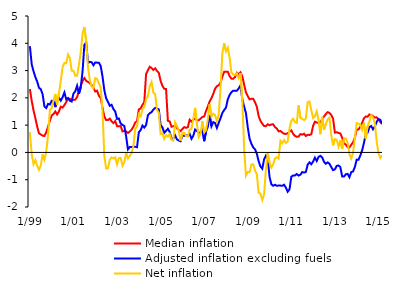
| Category | Median inflation | Adjusted inflation excluding fuels | Net inflation |
|---|---|---|---|
|  1/99 | 2.321 | 3.893 | 0.74 |
| 2 | 1.884 | 3.224 | -0.066 |
| 3 | 1.54 | 2.975 | -0.434 |
| 4 | 1.255 | 2.761 | -0.278 |
| 5 | 0.95 | 2.599 | -0.49 |
| 6 | 0.702 | 2.368 | -0.637 |
| 7 | 0.658 | 2.317 | -0.478 |
| 8 | 0.616 | 2.13 | -0.075 |
| 9 | 0.6 | 1.687 | -0.267 |
| 10 | 0.741 | 1.626 | 0.032 |
| 11 | 0.943 | 1.777 | 0.64 |
| 12 | 1.161 | 1.759 | 1.551 |
|  1/00 | 1.357 | 1.892 | 1.629 |
| 2 | 1.405 | 1.884 | 1.907 |
| 3 | 1.499 | 1.661 | 2.137 |
| 4 | 1.391 | 1.972 | 1.755 |
| 5 | 1.503 | 2.005 | 2.168 |
| 6 | 1.674 | 1.9 | 2.621 |
| 7 | 1.644 | 2.02 | 3.125 |
| 8 | 1.736 | 2.198 | 3.279 |
| 9 | 1.844 | 1.95 | 3.273 |
| 10 | 1.977 | 1.995 | 3.591 |
| 11 | 1.967 | 1.894 | 3.462 |
| 12 | 1.929 | 1.865 | 2.998 |
|  1/01 | 1.922 | 2.158 | 2.992 |
| 2 | 1.935 | 2.24 | 2.809 |
| 3 | 2.029 | 2.443 | 2.814 |
| 4 | 2.266 | 2.147 | 3.22 |
| 5 | 2.437 | 2.386 | 3.667 |
| 6 | 2.617 | 2.966 | 4.36 |
| 7 | 2.728 | 3.942 | 4.596 |
| 8 | 2.625 | 4.035 | 4.082 |
| 9 | 2.582 | 3.277 | 3.122 |
| 10 | 2.537 | 3.319 | 2.65 |
| 11 | 2.468 | 3.306 | 2.419 |
| 12 | 2.367 | 3.196 | 2.358 |
|  1/02 | 2.231 | 3.298 | 2.726 |
| 2 | 2.263 | 3.291 | 2.685 |
| 3 | 2.078 | 3.287 | 2.526 |
| 4 | 1.992 | 3.167 | 2.382 |
| 5 | 1.632 | 2.778 | 1.488 |
| 6 | 1.318 | 2.279 | -0.139 |
| 7 | 1.187 | 1.98 | -0.591 |
| 8 | 1.189 | 1.852 | -0.579 |
| 9 | 1.238 | 1.709 | -0.269 |
| 10 | 1.138 | 1.747 | -0.182 |
| 11 | 1.074 | 1.588 | -0.221 |
| 12 | 1.152 | 1.502 | -0.178 |
|  1/03 | 0.962 | 1.23 | -0.439 |
| 2 | 0.955 | 1.244 | -0.209 |
| 3 | 0.972 | 1.058 | -0.204 |
| 4 | 0.77 | 1.011 | -0.488 |
| 5 | 0.793 | 0.968 | -0.361 |
| 6 | 0.769 | 0.594 | -0.022 |
| 7 | 0.713 | 0.111 | -0.217 |
| 8 | 0.765 | 0.197 | -0.126 |
| 9 | 0.834 | 0.198 | -0.019 |
| 10 | 0.937 | 0.211 | 0.233 |
| 11 | 1.097 | 0.207 | 0.867 |
| 12 | 1.143 | 0.19 | 0.946 |
|  1/04 | 1.577 | 0.738 | 1.401 |
| 2 | 1.609 | 0.819 | 1.32 |
| 3 | 1.742 | 0.985 | 1.58 |
| 4 | 1.845 | 0.91 | 1.66 |
| 5 | 2.87 | 1.006 | 1.949 |
| 6 | 3.013 | 1.362 | 2.053 |
| 7 | 3.141 | 1.438 | 2.431 |
| 8 | 3.096 | 1.476 | 2.582 |
| 9 | 3.023 | 1.57 | 2.196 |
| 10 | 3.082 | 1.633 | 2.134 |
| 11 | 2.985 | 1.607 | 1.557 |
| 12 | 2.916 | 1.576 | 1.458 |
|  1/05 | 2.622 | 1.005 | 0.672 |
| 2 | 2.437 | 0.917 | 0.696 |
| 3 | 2.332 | 0.718 | 0.498 |
| 4 | 2.324 | 0.793 | 0.638 |
| 5 | 1.158 | 0.867 | 0.577 |
| 6 | 1.136 | 0.751 | 0.676 |
| 7 | 0.942 | 0.496 | 0.462 |
| 8 | 0.963 | 0.513 | 0.432 |
| 9 | 0.985 | 0.625 | 1.108 |
| 10 | 0.893 | 0.475 | 0.973 |
| 11 | 0.824 | 0.438 | 0.792 |
| 12 | 0.781 | 0.41 | 0.427 |
|  1/06 | 0.859 | 0.615 | 0.707 |
| 2 | 0.927 | 0.609 | 0.712 |
| 3 | 0.901 | 0.629 | 0.606 |
| 4 | 0.925 | 0.614 | 0.585 |
| 5 | 1.199 | 0.68 | 0.834 |
| 6 | 1.127 | 0.5 | 0.864 |
| 7 | 1.196 | 0.611 | 1.23 |
| 8 | 1.242 | 0.84 | 1.632 |
| 9 | 1.185 | 0.786 | 1.046 |
| 10 | 1.182 | 0.726 | 0.564 |
| 11 | 1.237 | 0.717 | 0.686 |
| 12 | 1.3 | 0.884 | 1.137 |
|  1/07 | 1.319 | 0.412 | 0.731 |
| 2 | 1.518 | 0.762 | 0.809 |
| 3 | 1.682 | 0.937 | 1.217 |
| 4 | 1.866 | 1.37 | 1.764 |
| 5 | 1.99 | 0.958 | 1.322 |
| 6 | 2.142 | 1.111 | 1.418 |
| 7 | 2.336 | 1.076 | 1.372 |
| 8 | 2.426 | 0.898 | 1.143 |
| 9 | 2.461 | 1.085 | 1.387 |
| 10 | 2.563 | 1.253 | 2.354 |
| 11 | 2.773 | 1.446 | 3.629 |
| 12 | 2.953 | 1.554 | 3.999 |
|  1/08 | 2.96 | 1.641 | 3.709 |
| 2 | 2.96 | 1.944 | 3.843 |
| 3 | 2.796 | 2.103 | 3.475 |
| 4 | 2.704 | 2.209 | 2.933 |
| 5 | 2.7 | 2.262 | 2.85 |
| 6 | 2.762 | 2.255 | 2.836 |
| 7 | 2.921 | 2.264 | 2.9 |
| 8 | 2.872 | 2.342 | 2.726 |
| 9 | 2.934 | 2.455 | 2.905 |
| 10 | 2.789 | 1.941 | 1.932 |
| 11 | 2.488 | 1.683 | 0.146 |
| 12 | 2.203 | 1.443 | -0.851 |
|  1/09 | 2.064 | 0.923 | -0.717 |
| 2 | 1.945 | 0.504 | -0.725 |
| 3 | 1.965 | 0.32 | -0.445 |
| 4 | 1.964 | 0.184 | -0.435 |
| 5 | 1.842 | 0.117 | -0.66 |
| 6 | 1.674 | -0.047 | -0.793 |
| 7 | 1.334 | -0.324 | -1.483 |
| 8 | 1.155 | -0.516 | -1.504 |
| 9 | 1.055 | -0.596 | -1.744 |
| 10 | 0.966 | -0.255 | -1.531 |
| 11 | 0.963 | -0.115 | -0.622 |
| 12 | 1.031 | -0.205 | 0.006 |
|  1/10 | 0.996 | -0.903 | -0.382 |
| 2 | 1.024 | -1.169 | -0.554 |
| 3 | 1.033 | -1.223 | -0.443 |
| 4 | 0.93 | -1.185 | -0.225 |
| 5 | 0.877 | -1.221 | -0.176 |
| 6 | 0.772 | -1.215 | -0.225 |
| 7 | 0.786 | -1.216 | 0.429 |
| 8 | 0.732 | -1.223 | 0.335 |
| 9 | 0.684 | -1.184 | 0.455 |
| 10 | 0.678 | -1.29 | 0.341 |
| 11 | 0.702 | -1.441 | 0.397 |
| 12 | 0.762 | -1.351 | 0.88 |
|  1/11 | 0.811 | -0.891 | 1.165 |
| 2 | 0.68 | -0.842 | 1.235 |
| 3 | 0.607 | -0.842 | 1.117 |
| 4 | 0.574 | -0.791 | 1.085 |
| 5 | 0.582 | -0.85 | 1.726 |
| 6 | 0.672 | -0.817 | 1.266 |
| 7 | 0.652 | -0.719 | 1.227 |
| 8 | 0.687 | -0.737 | 1.186 |
| 9 | 0.601 | -0.717 | 1.241 |
| 10 | 0.647 | -0.445 | 1.839 |
| 11 | 0.64 | -0.365 | 1.866 |
| 12 | 0.665 | -0.433 | 1.553 |
|  1/12 | 0.976 | -0.335 | 1.259 |
| 2 | 1.126 | -0.192 | 1.325 |
| 3 | 1.096 | -0.314 | 1.503 |
| 4 | 1.078 | -0.164 | 1.181 |
| 5 | 1.105 | -0.125 | 0.667 |
| 6 | 1.217 | -0.183 | 1.307 |
| 7 | 1.316 | -0.345 | 0.824 |
| 8 | 1.406 | -0.416 | 1.045 |
| 9 | 1.477 | -0.365 | 1.213 |
| 10 | 1.447 | -0.414 | 1.277 |
| 11 | 1.372 | -0.536 | 0.628 |
| 12 | 1.239 | -0.65 | 0.259 |
|  1/13 | 0.726 | -0.62 | 0.489 |
| 2 | 0.741 | -0.494 | 0.459 |
| 3 | 0.712 | -0.479 | 0.222 |
| 4 | 0.695 | -0.536 | 0.442 |
| 5 | 0.542 | -0.879 | 0.13 |
| 6 | 0.335 | -0.884 | 0.51 |
| 7 | 0.288 | -0.802 | 0.514 |
| 8 | 0.195 | -0.787 | 0.353 |
| 9 | 0.18 | -0.909 | -0.063 |
| 10 | 0.28 | -0.723 | -0.223 |
| 11 | 0.373 | -0.698 | -0.011 |
| 12 | 0.535 | -0.531 | 0.527 |
|  1/14 | 0.836 | -0.264 | 1.075 |
| 2 | 0.842 | -0.268 | 1.05 |
| 3 | 0.945 | -0.114 | 1.029 |
| 4 | 1.081 | 0.078 | 0.831 |
| 5 | 1.248 | 0.346 | 1.085 |
| 6 | 1.315 | 0.675 | 0.504 |
| 7 | 1.31 | 0.717 | 0.96 |
| 8 | 1.391 | 0.929 | 1.124 |
| 9 | 1.371 | 0.97 | 1.365 |
| 10 | 1.327 | 0.848 | 1.281 |
| 11 | 1.278 | 0.948 | 1.069 |
| 12 | 1.286 | 1.12 | 0.411 |
|  1/15 | 1.216 | 1.22 | -0.027 |
| 2 | 1.112 | 1.195 | -0.204 |
| 3 | 1.043 | 1.05 | -0.11 |